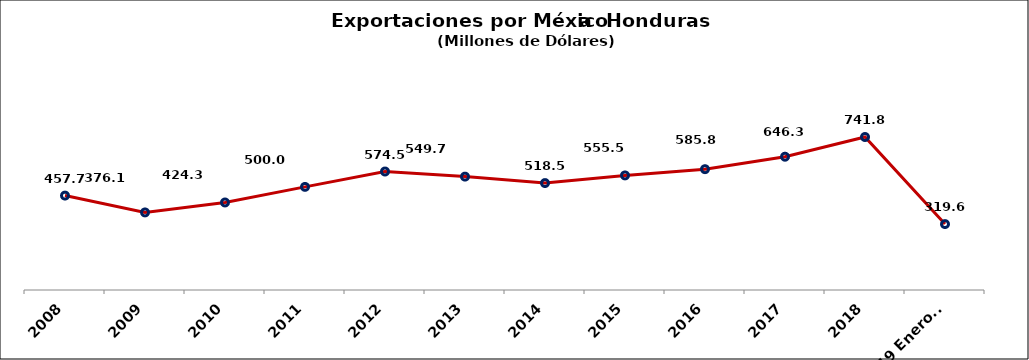
| Category | Series 0 |
|---|---|
| 2008 | 457.741 |
| 2009 | 376.133 |
| 2010 | 424.348 |
| 2011 | 499.96 |
| 2012 | 574.485 |
| 2013 | 549.746 |
| 2014 | 518.469 |
| 2015 | 555.54 |
| 2016 | 585.808 |
| 2017 | 646.3 |
| 2018 | 741.8 |
| 2019 Enero-Mayo | 319.6 |